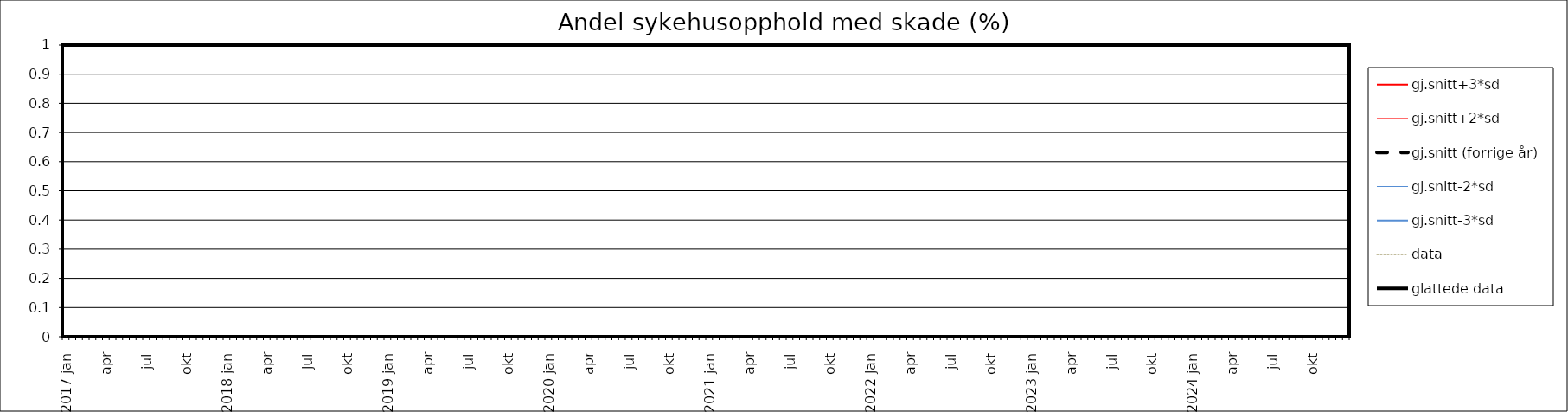
| Category | gj.snitt+3*sd | gj.snitt+2*sd | gj.snitt (forrige år) | gj.snitt-2*sd | gj.snitt-3*sd | data | glattede data |
|---|---|---|---|---|---|---|---|
| 2017 jan | 0 | 0 | 0 | 0 | 0 | 0 | 0 |
|  | 0 | 0 | 0 | 0 | 0 | 0 | 0 |
| feb | 0 | 0 | 0 | 0 | 0 | 0 | 0 |
|  | 0 | 0 | 0 | 0 | 0 | 0 | 0 |
| mar | 0 | 0 | 0 | 0 | 0 | 0 | 0 |
|  | 0 | 0 | 0 | 0 | 0 | 0 | 0 |
| apr | 0 | 0 | 0 | 0 | 0 | 0 | 0 |
|  | 0 | 0 | 0 | 0 | 0 | 0 | 0 |
| mai | 0 | 0 | 0 | 0 | 0 | 0 | 0 |
|  | 0 | 0 | 0 | 0 | 0 | 0 | 0 |
| jun | 0 | 0 | 0 | 0 | 0 | 0 | 0 |
|  | 0 | 0 | 0 | 0 | 0 | 0 | 0 |
| jul | 0 | 0 | 0 | 0 | 0 | 0 | 0 |
|  | 0 | 0 | 0 | 0 | 0 | 0 | 0 |
| aug | 0 | 0 | 0 | 0 | 0 | 0 | 0 |
|  | 0 | 0 | 0 | 0 | 0 | 0 | 0 |
| sep | 0 | 0 | 0 | 0 | 0 | 0 | 0 |
|  | 0 | 0 | 0 | 0 | 0 | 0 | 0 |
| okt | 0 | 0 | 0 | 0 | 0 | 0 | 0 |
|  | 0 | 0 | 0 | 0 | 0 | 0 | 0 |
| nov | 0 | 0 | 0 | 0 | 0 | 0 | 0 |
|  | 0 | 0 | 0 | 0 | 0 | 0 | 0 |
| des | 0 | 0 | 0 | 0 | 0 | 0 | 0 |
|  | 0 | 0 | 0 | 0 | 0 | 0 | 0 |
| 2018 jan | 0 | 0 | 0 | 0 | 0 | 0 | 0 |
|  | 0 | 0 | 0 | 0 | 0 | 0 | 0 |
| feb | 0 | 0 | 0 | 0 | 0 | 0 | 0 |
|  | 0 | 0 | 0 | 0 | 0 | 0 | 0 |
| mar | 0 | 0 | 0 | 0 | 0 | 0 | 0 |
|  | 0 | 0 | 0 | 0 | 0 | 0 | 0 |
| apr | 0 | 0 | 0 | 0 | 0 | 0 | 0 |
|  | 0 | 0 | 0 | 0 | 0 | 0 | 0 |
| mai | 0 | 0 | 0 | 0 | 0 | 0 | 0 |
|  | 0 | 0 | 0 | 0 | 0 | 0 | 0 |
| jun | 0 | 0 | 0 | 0 | 0 | 0 | 0 |
|  | 0 | 0 | 0 | 0 | 0 | 0 | 0 |
| jul | 0 | 0 | 0 | 0 | 0 | 0 | 0 |
|  | 0 | 0 | 0 | 0 | 0 | 0 | 0 |
| aug | 0 | 0 | 0 | 0 | 0 | 0 | 0 |
|  | 0 | 0 | 0 | 0 | 0 | 0 | 0 |
| sep | 0 | 0 | 0 | 0 | 0 | 0 | 0 |
|  | 0 | 0 | 0 | 0 | 0 | 0 | 0 |
| okt | 0 | 0 | 0 | 0 | 0 | 0 | 0 |
|  | 0 | 0 | 0 | 0 | 0 | 0 | 0 |
| nov | 0 | 0 | 0 | 0 | 0 | 0 | 0 |
|  | 0 | 0 | 0 | 0 | 0 | 0 | 0 |
| des | 0 | 0 | 0 | 0 | 0 | 0 | 0 |
|  | 0 | 0 | 0 | 0 | 0 | 0 | 0 |
| 2019 jan | 0 | 0 | 0 | 0 | 0 | 0 | 0 |
|  | 0 | 0 | 0 | 0 | 0 | 0 | 0 |
| feb | 0 | 0 | 0 | 0 | 0 | 0 | 0 |
|  | 0 | 0 | 0 | 0 | 0 | 0 | 0 |
| mar | 0 | 0 | 0 | 0 | 0 | 0 | 0 |
|  | 0 | 0 | 0 | 0 | 0 | 0 | 0 |
| apr | 0 | 0 | 0 | 0 | 0 | 0 | 0 |
|  | 0 | 0 | 0 | 0 | 0 | 0 | 0 |
| mai | 0 | 0 | 0 | 0 | 0 | 0 | 0 |
|  | 0 | 0 | 0 | 0 | 0 | 0 | 0 |
| jun | 0 | 0 | 0 | 0 | 0 | 0 | 0 |
|  | 0 | 0 | 0 | 0 | 0 | 0 | 0 |
| jul | 0 | 0 | 0 | 0 | 0 | 0 | 0 |
|  | 0 | 0 | 0 | 0 | 0 | 0 | 0 |
| aug | 0 | 0 | 0 | 0 | 0 | 0 | 0 |
|  | 0 | 0 | 0 | 0 | 0 | 0 | 0 |
| sep | 0 | 0 | 0 | 0 | 0 | 0 | 0 |
|  | 0 | 0 | 0 | 0 | 0 | 0 | 0 |
| okt | 0 | 0 | 0 | 0 | 0 | 0 | 0 |
|  | 0 | 0 | 0 | 0 | 0 | 0 | 0 |
| nov | 0 | 0 | 0 | 0 | 0 | 0 | 0 |
|  | 0 | 0 | 0 | 0 | 0 | 0 | 0 |
| des | 0 | 0 | 0 | 0 | 0 | 0 | 0 |
|  | 0 | 0 | 0 | 0 | 0 | 0 | 0 |
| 2020 jan | 0 | 0 | 0 | 0 | 0 | 0 | 0 |
|  | 0 | 0 | 0 | 0 | 0 | 0 | 0 |
| feb | 0 | 0 | 0 | 0 | 0 | 0 | 0 |
|  | 0 | 0 | 0 | 0 | 0 | 0 | 0 |
| mar | 0 | 0 | 0 | 0 | 0 | 0 | 0 |
|  | 0 | 0 | 0 | 0 | 0 | 0 | 0 |
| apr | 0 | 0 | 0 | 0 | 0 | 0 | 0 |
|  | 0 | 0 | 0 | 0 | 0 | 0 | 0 |
| mai | 0 | 0 | 0 | 0 | 0 | 0 | 0 |
|  | 0 | 0 | 0 | 0 | 0 | 0 | 0 |
| jun | 0 | 0 | 0 | 0 | 0 | 0 | 0 |
|  | 0 | 0 | 0 | 0 | 0 | 0 | 0 |
| jul | 0 | 0 | 0 | 0 | 0 | 0 | 0 |
|  | 0 | 0 | 0 | 0 | 0 | 0 | 0 |
| aug | 0 | 0 | 0 | 0 | 0 | 0 | 0 |
|  | 0 | 0 | 0 | 0 | 0 | 0 | 0 |
| sep | 0 | 0 | 0 | 0 | 0 | 0 | 0 |
|  | 0 | 0 | 0 | 0 | 0 | 0 | 0 |
| okt | 0 | 0 | 0 | 0 | 0 | 0 | 0 |
|  | 0 | 0 | 0 | 0 | 0 | 0 | 0 |
| nov | 0 | 0 | 0 | 0 | 0 | 0 | 0 |
|  | 0 | 0 | 0 | 0 | 0 | 0 | 0 |
| des | 0 | 0 | 0 | 0 | 0 | 0 | 0 |
|  | 0 | 0 | 0 | 0 | 0 | 0 | 0 |
| 2021 jan | 0 | 0 | 0 | 0 | 0 | 0 | 0 |
|  | 0 | 0 | 0 | 0 | 0 | 0 | 0 |
| feb | 0 | 0 | 0 | 0 | 0 | 0 | 0 |
|  | 0 | 0 | 0 | 0 | 0 | 0 | 0 |
| mar | 0 | 0 | 0 | 0 | 0 | 0 | 0 |
|  | 0 | 0 | 0 | 0 | 0 | 0 | 0 |
| apr | 0 | 0 | 0 | 0 | 0 | 0 | 0 |
|  | 0 | 0 | 0 | 0 | 0 | 0 | 0 |
| mai | 0 | 0 | 0 | 0 | 0 | 0 | 0 |
|  | 0 | 0 | 0 | 0 | 0 | 0 | 0 |
| jun | 0 | 0 | 0 | 0 | 0 | 0 | 0 |
|  | 0 | 0 | 0 | 0 | 0 | 0 | 0 |
| jul | 0 | 0 | 0 | 0 | 0 | 0 | 0 |
|  | 0 | 0 | 0 | 0 | 0 | 0 | 0 |
| aug | 0 | 0 | 0 | 0 | 0 | 0 | 0 |
|  | 0 | 0 | 0 | 0 | 0 | 0 | 0 |
| sep | 0 | 0 | 0 | 0 | 0 | 0 | 0 |
|  | 0 | 0 | 0 | 0 | 0 | 0 | 0 |
| okt | 0 | 0 | 0 | 0 | 0 | 0 | 0 |
|  | 0 | 0 | 0 | 0 | 0 | 0 | 0 |
| nov | 0 | 0 | 0 | 0 | 0 | 0 | 0 |
|  | 0 | 0 | 0 | 0 | 0 | 0 | 0 |
| des | 0 | 0 | 0 | 0 | 0 | 0 | 0 |
|  | 0 | 0 | 0 | 0 | 0 | 0 | 0 |
| 2022 jan | 0 | 0 | 0 | 0 | 0 | 0 | 0 |
|  | 0 | 0 | 0 | 0 | 0 | 0 | 0 |
| feb | 0 | 0 | 0 | 0 | 0 | 0 | 0 |
|  | 0 | 0 | 0 | 0 | 0 | 0 | 0 |
| mar | 0 | 0 | 0 | 0 | 0 | 0 | 0 |
|  | 0 | 0 | 0 | 0 | 0 | 0 | 0 |
| apr | 0 | 0 | 0 | 0 | 0 | 0 | 0 |
|  | 0 | 0 | 0 | 0 | 0 | 0 | 0 |
| mai | 0 | 0 | 0 | 0 | 0 | 0 | 0 |
|  | 0 | 0 | 0 | 0 | 0 | 0 | 0 |
| jun | 0 | 0 | 0 | 0 | 0 | 0 | 0 |
|  | 0 | 0 | 0 | 0 | 0 | 0 | 0 |
| jul | 0 | 0 | 0 | 0 | 0 | 0 | 0 |
|  | 0 | 0 | 0 | 0 | 0 | 0 | 0 |
| aug | 0 | 0 | 0 | 0 | 0 | 0 | 0 |
|  | 0 | 0 | 0 | 0 | 0 | 0 | 0 |
| sep | 0 | 0 | 0 | 0 | 0 | 0 | 0 |
|  | 0 | 0 | 0 | 0 | 0 | 0 | 0 |
| okt | 0 | 0 | 0 | 0 | 0 | 0 | 0 |
|  | 0 | 0 | 0 | 0 | 0 | 0 | 0 |
| nov | 0 | 0 | 0 | 0 | 0 | 0 | 0 |
|  | 0 | 0 | 0 | 0 | 0 | 0 | 0 |
| des | 0 | 0 | 0 | 0 | 0 | 0 | 0 |
|  | 0 | 0 | 0 | 0 | 0 | 0 | 0 |
| 2023 jan | 0 | 0 | 0 | 0 | 0 | 0 | 0 |
|  | 0 | 0 | 0 | 0 | 0 | 0 | 0 |
| feb | 0 | 0 | 0 | 0 | 0 | 0 | 0 |
|  | 0 | 0 | 0 | 0 | 0 | 0 | 0 |
| mar | 0 | 0 | 0 | 0 | 0 | 0 | 0 |
|  | 0 | 0 | 0 | 0 | 0 | 0 | 0 |
| apr | 0 | 0 | 0 | 0 | 0 | 0 | 0 |
|  | 0 | 0 | 0 | 0 | 0 | 0 | 0 |
| mai | 0 | 0 | 0 | 0 | 0 | 0 | 0 |
|  | 0 | 0 | 0 | 0 | 0 | 0 | 0 |
| jun | 0 | 0 | 0 | 0 | 0 | 0 | 0 |
|  | 0 | 0 | 0 | 0 | 0 | 0 | 0 |
| jul | 0 | 0 | 0 | 0 | 0 | 0 | 0 |
|  | 0 | 0 | 0 | 0 | 0 | 0 | 0 |
| aug | 0 | 0 | 0 | 0 | 0 | 0 | 0 |
|  | 0 | 0 | 0 | 0 | 0 | 0 | 0 |
| sep | 0 | 0 | 0 | 0 | 0 | 0 | 0 |
|  | 0 | 0 | 0 | 0 | 0 | 0 | 0 |
| okt | 0 | 0 | 0 | 0 | 0 | 0 | 0 |
|  | 0 | 0 | 0 | 0 | 0 | 0 | 0 |
| nov | 0 | 0 | 0 | 0 | 0 | 0 | 0 |
|  | 0 | 0 | 0 | 0 | 0 | 0 | 0 |
| des | 0 | 0 | 0 | 0 | 0 | 0 | 0 |
|  | 0 | 0 | 0 | 0 | 0 | 0 | 0 |
| 2024 jan | 0 | 0 | 0 | 0 | 0 | 0 | 0 |
|  | 0 | 0 | 0 | 0 | 0 | 0 | 0 |
| feb | 0 | 0 | 0 | 0 | 0 | 0 | 0 |
|  | 0 | 0 | 0 | 0 | 0 | 0 | 0 |
| mar | 0 | 0 | 0 | 0 | 0 | 0 | 0 |
|  | 0 | 0 | 0 | 0 | 0 | 0 | 0 |
| apr | 0 | 0 | 0 | 0 | 0 | 0 | 0 |
|  | 0 | 0 | 0 | 0 | 0 | 0 | 0 |
| mai | 0 | 0 | 0 | 0 | 0 | 0 | 0 |
|  | 0 | 0 | 0 | 0 | 0 | 0 | 0 |
| jun | 0 | 0 | 0 | 0 | 0 | 0 | 0 |
|  | 0 | 0 | 0 | 0 | 0 | 0 | 0 |
| jul | 0 | 0 | 0 | 0 | 0 | 0 | 0 |
|  | 0 | 0 | 0 | 0 | 0 | 0 | 0 |
| aug | 0 | 0 | 0 | 0 | 0 | 0 | 0 |
|  | 0 | 0 | 0 | 0 | 0 | 0 | 0 |
| sep | 0 | 0 | 0 | 0 | 0 | 0 | 0 |
|  | 0 | 0 | 0 | 0 | 0 | 0 | 0 |
| okt | 0 | 0 | 0 | 0 | 0 | 0 | 0 |
|  | 0 | 0 | 0 | 0 | 0 | 0 | 0 |
| nov | 0 | 0 | 0 | 0 | 0 | 0 | 0 |
|  | 0 | 0 | 0 | 0 | 0 | 0 | 0 |
| des | 0 | 0 | 0 | 0 | 0 | 0 | 0 |